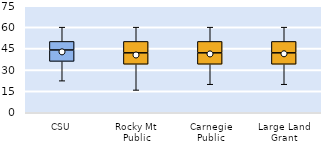
| Category | 25th | 50th | 75th |
|---|---|---|---|
| CSU | 36 | 8 | 6 |
| Rocky Mt Public | 34 | 8 | 8 |
| Carnegie Public | 34 | 8 | 8 |
| Large Land Grant | 34 | 8 | 8 |